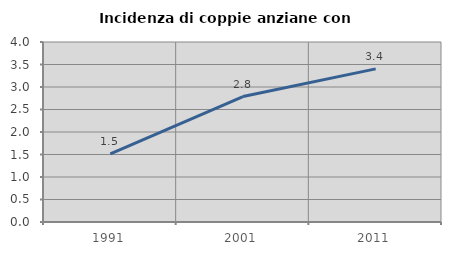
| Category | Incidenza di coppie anziane con figli |
|---|---|
| 1991.0 | 1.512 |
| 2001.0 | 2.787 |
| 2011.0 | 3.403 |